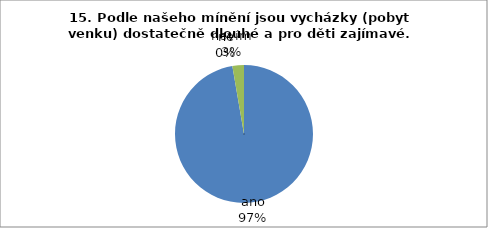
| Category | 15. Podle našeho mínění jsou vycházky (pobyt venku) dostatečně dlouhé a pro děti zajímavé. |
|---|---|
| ano | 36 |
| ne | 0 |
| nevím | 1 |